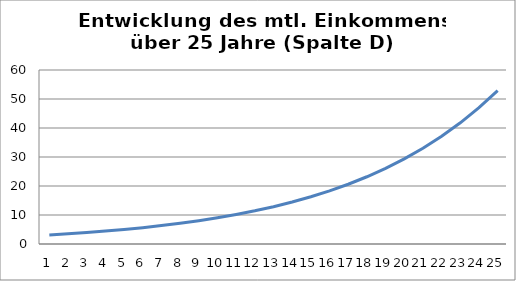
| Category | Series 0 |
|---|---|
| 0 | 3.129 |
| 1 | 3.52 |
| 2 | 3.96 |
| 3 | 4.456 |
| 4 | 5.013 |
| 5 | 5.639 |
| 6 | 6.345 |
| 7 | 7.138 |
| 8 | 8.03 |
| 9 | 9.034 |
| 10 | 10.164 |
| 11 | 11.435 |
| 12 | 12.865 |
| 13 | 14.473 |
| 14 | 16.283 |
| 15 | 18.319 |
| 16 | 20.609 |
| 17 | 23.186 |
| 18 | 26.085 |
| 19 | 29.346 |
| 20 | 33.015 |
| 21 | 37.143 |
| 22 | 41.787 |
| 23 | 47.012 |
| 24 | 52.89 |